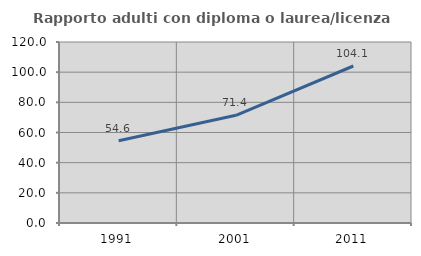
| Category | Rapporto adulti con diploma o laurea/licenza media  |
|---|---|
| 1991.0 | 54.58 |
| 2001.0 | 71.416 |
| 2011.0 | 104.085 |